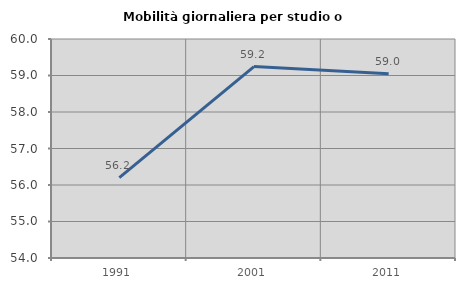
| Category | Mobilità giornaliera per studio o lavoro |
|---|---|
| 1991.0 | 56.2 |
| 2001.0 | 59.245 |
| 2011.0 | 59.047 |